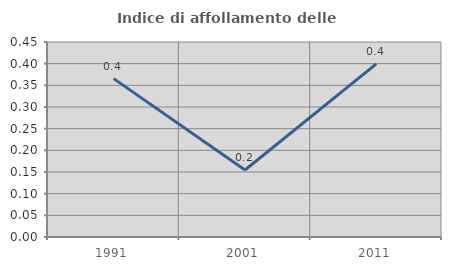
| Category | Indice di affollamento delle abitazioni  |
|---|---|
| 1991.0 | 0.365 |
| 2001.0 | 0.155 |
| 2011.0 | 0.4 |